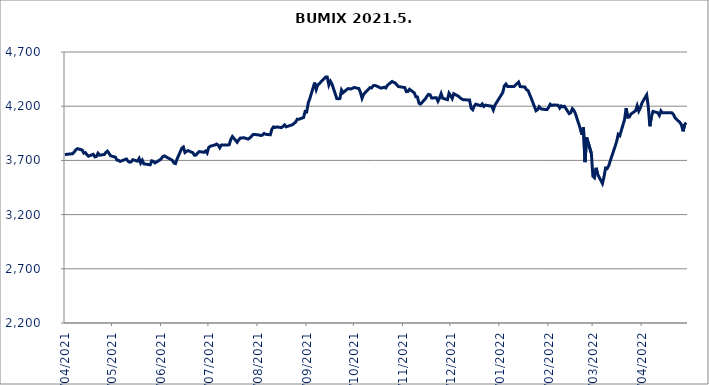
| Category | BUMIX |
|---|---|
| 01/04/2021 | 3754.04 |
| 06/04/2021 | 3761.95 |
| 07/04/2021 | 3777.27 |
| 08/04/2021 | 3798.2 |
| 09/04/2021 | 3808.26 |
| 12/04/2021 | 3795.78 |
| 13/04/2021 | 3766.75 |
| 14/04/2021 | 3771.86 |
| 15/04/2021 | 3753.41 |
| 16/04/2021 | 3738.77 |
| 19/04/2021 | 3756.43 |
| 20/04/2021 | 3732.67 |
| 21/04/2021 | 3736.16 |
| 22/04/2021 | 3766.06 |
| 23/04/2021 | 3747.88 |
| 26/04/2021 | 3754.41 |
| 27/04/2021 | 3774.04 |
| 28/04/2021 | 3785.46 |
| 29/04/2021 | 3764.89 |
| 30/04/2021 | 3742.28 |
| 03/05/2021 | 3730.11 |
| 04/05/2021 | 3702.37 |
| 05/05/2021 | 3700.76 |
| 06/05/2021 | 3690.24 |
| 07/05/2021 | 3696.3 |
| 10/05/2021 | 3712.94 |
| 11/05/2021 | 3692.08 |
| 12/05/2021 | 3683.66 |
| 13/05/2021 | 3686.36 |
| 14/05/2021 | 3706.54 |
| 17/05/2021 | 3693.36 |
| 18/05/2021 | 3718.14 |
| 19/05/2021 | 3676.61 |
| 20/05/2021 | 3701.45 |
| 21/05/2021 | 3667.93 |
| 25/05/2021 | 3659.42 |
| 26/05/2021 | 3695.97 |
| 27/05/2021 | 3691.66 |
| 28/05/2021 | 3676.84 |
| 31/05/2021 | 3702.72 |
| 01/06/2021 | 3715.57 |
| 02/06/2021 | 3735.73 |
| 03/06/2021 | 3741.61 |
| 04/06/2021 | 3733.15 |
| 07/06/2021 | 3709.46 |
| 08/06/2021 | 3700.79 |
| 09/06/2021 | 3676.16 |
| 10/06/2021 | 3670.48 |
| 11/06/2021 | 3712.42 |
| 14/06/2021 | 3812.06 |
| 15/06/2021 | 3823.15 |
| 16/06/2021 | 3772.74 |
| 17/06/2021 | 3784 |
| 18/06/2021 | 3789.98 |
| 21/06/2021 | 3770.52 |
| 22/06/2021 | 3747.49 |
| 23/06/2021 | 3749.3 |
| 24/06/2021 | 3767.66 |
| 25/06/2021 | 3781.28 |
| 28/06/2021 | 3774.78 |
| 29/06/2021 | 3786.58 |
| 30/06/2021 | 3767.61 |
| 01/07/2021 | 3818.34 |
| 02/07/2021 | 3830.52 |
| 05/07/2021 | 3842.74 |
| 06/07/2021 | 3850.72 |
| 07/07/2021 | 3840.93 |
| 08/07/2021 | 3816.21 |
| 09/07/2021 | 3841.96 |
| 12/07/2021 | 3842.91 |
| 13/07/2021 | 3842.17 |
| 14/07/2021 | 3844.48 |
| 15/07/2021 | 3893.9 |
| 16/07/2021 | 3920.28 |
| 19/07/2021 | 3867.14 |
| 20/07/2021 | 3890.16 |
| 21/07/2021 | 3906.3 |
| 22/07/2021 | 3905.88 |
| 23/07/2021 | 3910.05 |
| 26/07/2021 | 3897.02 |
| 27/07/2021 | 3907.07 |
| 28/07/2021 | 3922 |
| 29/07/2021 | 3937.81 |
| 30/07/2021 | 3939.4 |
| 02/08/2021 | 3934.13 |
| 03/08/2021 | 3929.12 |
| 04/08/2021 | 3933.57 |
| 05/08/2021 | 3948.67 |
| 06/08/2021 | 3940.84 |
| 09/08/2021 | 3936.39 |
| 10/08/2021 | 3988.56 |
| 11/08/2021 | 4008.96 |
| 12/08/2021 | 4002.87 |
| 13/08/2021 | 4009.14 |
| 16/08/2021 | 4002.18 |
| 17/08/2021 | 4013.31 |
| 18/08/2021 | 4027.31 |
| 19/08/2021 | 4009.73 |
| 23/08/2021 | 4029.07 |
| 24/08/2021 | 4041.06 |
| 25/08/2021 | 4053.57 |
| 26/08/2021 | 4080.45 |
| 27/08/2021 | 4079.53 |
| 30/08/2021 | 4095.22 |
| 31/08/2021 | 4151.22 |
| 01/09/2021 | 4147.64 |
| 02/09/2021 | 4233.18 |
| 03/09/2021 | 4271.59 |
| 06/09/2021 | 4417.57 |
| 07/09/2021 | 4354.49 |
| 08/09/2021 | 4395.86 |
| 09/09/2021 | 4407.76 |
| 10/09/2021 | 4424.38 |
| 13/09/2021 | 4468.47 |
| 14/09/2021 | 4468.74 |
| 15/09/2021 | 4395.2 |
| 16/09/2021 | 4429.91 |
| 17/09/2021 | 4404.2 |
| 20/09/2021 | 4270.78 |
| 21/09/2021 | 4268.42 |
| 22/09/2021 | 4270.89 |
| 23/09/2021 | 4349.07 |
| 24/09/2021 | 4324.31 |
| 27/09/2021 | 4362.09 |
| 28/09/2021 | 4360.92 |
| 29/09/2021 | 4358.99 |
| 30/09/2021 | 4365.64 |
| 01/10/2021 | 4372.74 |
| 04/10/2021 | 4362.94 |
| 05/10/2021 | 4326.82 |
| 06/10/2021 | 4273.07 |
| 07/10/2021 | 4310.14 |
| 08/10/2021 | 4325.13 |
| 11/10/2021 | 4371.07 |
| 12/10/2021 | 4368.19 |
| 13/10/2021 | 4388.26 |
| 14/10/2021 | 4392.24 |
| 15/10/2021 | 4387.15 |
| 18/10/2021 | 4366.68 |
| 19/10/2021 | 4370.65 |
| 20/10/2021 | 4375.2 |
| 21/10/2021 | 4367.75 |
| 22/10/2021 | 4392.46 |
| 25/10/2021 | 4428.31 |
| 26/10/2021 | 4419.51 |
| 27/10/2021 | 4414.15 |
| 28/10/2021 | 4396.35 |
| 29/10/2021 | 4381.14 |
| 02/11/2021 | 4371.95 |
| 03/11/2021 | 4334.22 |
| 04/11/2021 | 4335.89 |
| 05/11/2021 | 4356.33 |
| 08/11/2021 | 4323.72 |
| 09/11/2021 | 4286.95 |
| 10/11/2021 | 4285.37 |
| 11/11/2021 | 4226.99 |
| 12/11/2021 | 4219.97 |
| 15/11/2021 | 4267.57 |
| 16/11/2021 | 4290.72 |
| 17/11/2021 | 4308.88 |
| 18/11/2021 | 4305.32 |
| 19/11/2021 | 4275.83 |
| 22/11/2021 | 4277.83 |
| 23/11/2021 | 4245.77 |
| 24/11/2021 | 4275.81 |
| 25/11/2021 | 4316.18 |
| 26/11/2021 | 4273.42 |
| 29/11/2021 | 4260.04 |
| 30/11/2021 | 4320.18 |
| 01/12/2021 | 4297.37 |
| 02/12/2021 | 4270.44 |
| 03/12/2021 | 4315.39 |
| 06/12/2021 | 4291.58 |
| 07/12/2021 | 4277.37 |
| 08/12/2021 | 4266.9 |
| 09/12/2021 | 4259.57 |
| 10/12/2021 | 4258.95 |
| 13/12/2021 | 4256.89 |
| 14/12/2021 | 4182.68 |
| 15/12/2021 | 4167.99 |
| 16/12/2021 | 4203.45 |
| 17/12/2021 | 4218.74 |
| 20/12/2021 | 4203.79 |
| 21/12/2021 | 4220.66 |
| 22/12/2021 | 4197.58 |
| 23/12/2021 | 4209.89 |
| 27/12/2021 | 4199.65 |
| 28/12/2021 | 4165.48 |
| 29/12/2021 | 4209.66 |
| 30/12/2021 | 4232.45 |
| 03/01/2022 | 4326.64 |
| 04/01/2022 | 4388.32 |
| 05/01/2022 | 4404.2 |
| 06/01/2022 | 4382.17 |
| 07/01/2022 | 4382.58 |
| 10/01/2022 | 4381.19 |
| 11/01/2022 | 4394.39 |
| 12/01/2022 | 4408.77 |
| 13/01/2022 | 4421.96 |
| 14/01/2022 | 4380.91 |
| 17/01/2022 | 4376.9 |
| 18/01/2022 | 4351.82 |
| 19/01/2022 | 4344.07 |
| 20/01/2022 | 4308.05 |
| 21/01/2022 | 4272.85 |
| 24/01/2022 | 4158.45 |
| 25/01/2022 | 4168.17 |
| 26/01/2022 | 4194.84 |
| 27/01/2022 | 4177.94 |
| 28/01/2022 | 4172.22 |
| 31/01/2022 | 4168.76 |
| 01/02/2022 | 4189.4 |
| 02/02/2022 | 4217.95 |
| 03/02/2022 | 4206.58 |
| 04/02/2022 | 4211.13 |
| 07/02/2022 | 4209 |
| 08/02/2022 | 4183.07 |
| 09/02/2022 | 4202.77 |
| 10/02/2022 | 4194.07 |
| 11/02/2022 | 4199.2 |
| 14/02/2022 | 4131.52 |
| 15/02/2022 | 4140.47 |
| 16/02/2022 | 4177.18 |
| 17/02/2022 | 4161.67 |
| 18/02/2022 | 4128.63 |
| 21/02/2022 | 3993.64 |
| 22/02/2022 | 3936.35 |
| 23/02/2022 | 4004.05 |
| 24/02/2022 | 3684.09 |
| 25/02/2022 | 3912.97 |
| 28/02/2022 | 3765.1 |
| 01/03/2022 | 3553.22 |
| 02/03/2022 | 3540.05 |
| 03/03/2022 | 3632.01 |
| 04/03/2022 | 3572.17 |
| 07/03/2022 | 3487.12 |
| 08/03/2022 | 3546.98 |
| 09/03/2022 | 3629.46 |
| 10/03/2022 | 3624.46 |
| 11/03/2022 | 3652.02 |
| 16/03/2022 | 3873.52 |
| 17/03/2022 | 3940.33 |
| 18/03/2022 | 3928.07 |
| 21/03/2022 | 4076.32 |
| 22/03/2022 | 4180.67 |
| 23/03/2022 | 4097.87 |
| 24/03/2022 | 4099.91 |
| 25/03/2022 | 4126.59 |
| 28/03/2022 | 4158.49 |
| 29/03/2022 | 4204.68 |
| 30/03/2022 | 4154.82 |
| 31/03/2022 | 4184.56 |
| 01/04/2022 | 4229.64 |
| 04/04/2022 | 4304.06 |
| 05/04/2022 | 4197.75 |
| 06/04/2022 | 4014.98 |
| 07/04/2022 | 4103.67 |
| 08/04/2022 | 4151.86 |
| 11/04/2022 | 4139.94 |
| 12/04/2022 | 4115.21 |
| 13/04/2022 | 4157.17 |
| 14/04/2022 | 4138.88 |
| 19/04/2022 | 4140.64 |
| 20/04/2022 | 4138.59 |
| 21/04/2022 | 4122.37 |
| 22/04/2022 | 4091.5 |
| 25/04/2022 | 4050.28 |
| 26/04/2022 | 4028.27 |
| 27/04/2022 | 3968.29 |
| 28/04/2022 | 4029.19 |
| 29/04/2022 | 4048.63 |